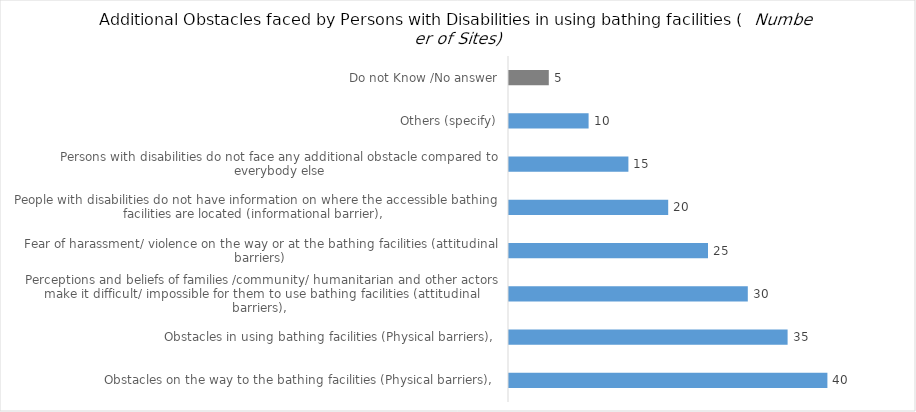
| Category | Additional Obstacles faced by Persons with Disabilities in using bathing facilities |
|---|---|
| Obstacles on the way to the bathing facilities (Physical barriers),  | 40 |
| Obstacles in using bathing facilities (Physical barriers),  | 35 |
| Perceptions and beliefs of families /community/ humanitarian and other actors make it difficult/ impossible for them to use bathing facilities (attitudinal barriers),  | 30 |
| Fear of harassment/ violence on the way or at the bathing facilities (attitudinal barriers)  | 25 |
| People with disabilities do not have information on where the accessible bathing facilities are located (informational barrier),  | 20 |
| Persons with disabilities do not face any additional obstacle compared to everybody else | 15 |
| Others (specify) | 10 |
| Do not Know /No answer | 5 |